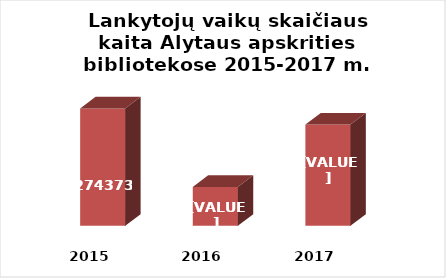
| Category | Series 0 |
|---|---|
| 2015.0 | 274373 |
| 2016.0 | 254715 |
| 2017.0 | 270333 |